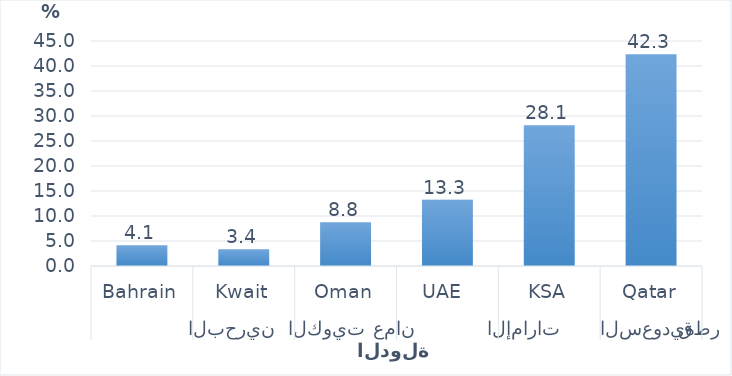
| Category | Series 0 |
|---|---|
| 0 | 42.342 |
| 1 | 28.148 |
| 2 | 13.255 |
| 3 | 8.772 |
| 4 | 3.357 |
| 5 | 4.126 |